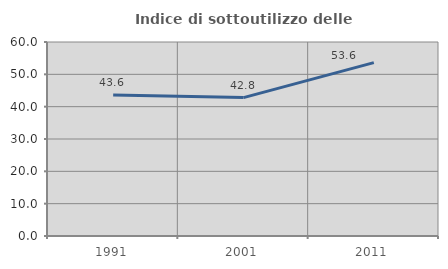
| Category | Indice di sottoutilizzo delle abitazioni  |
|---|---|
| 1991.0 | 43.609 |
| 2001.0 | 42.807 |
| 2011.0 | 53.612 |